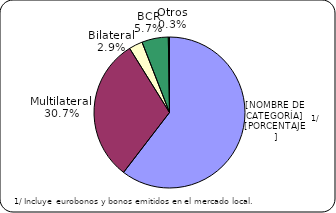
| Category | Series 0 |
|---|---|
| Inversionistas | 7497.7 |
| Multilateral | 3814.2 |
| Bilateral | 363.7 |
| BCR | 704.3 |
| Otros | 30.8 |